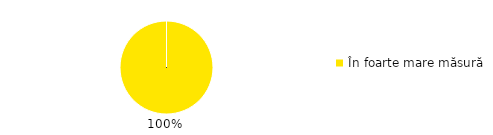
| Category | Total |
|---|---|
| În foarte mare măsură | 1 |